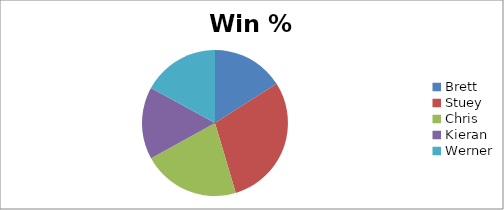
| Category | Win % |
|---|---|
| Brett | 14.815 |
| Stuey | 27.273 |
| Chris | 20 |
| Kieran | 14.815 |
| Werner | 15.789 |